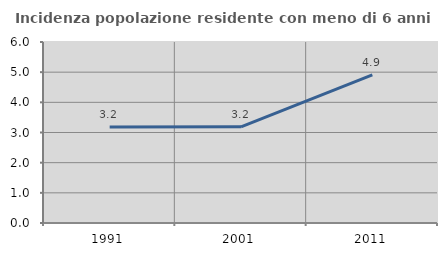
| Category | Incidenza popolazione residente con meno di 6 anni |
|---|---|
| 1991.0 | 3.178 |
| 2001.0 | 3.189 |
| 2011.0 | 4.91 |